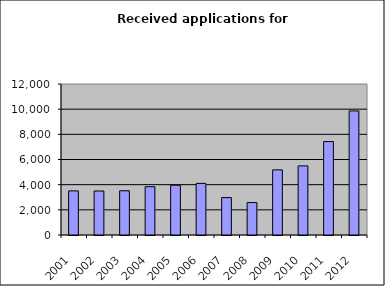
| Category | Series 0 |
|---|---|
| 2001.0 | 3505 |
| 2002.0 | 3497 |
| 2003.0 | 3516 |
| 2004.0 | 3838 |
| 2005.0 | 3956 |
| 2006.0 | 4101 |
| 2007.0 | 2972 |
| 2008.0 | 2577 |
| 2009.0 | 5177 |
| 2010.0 | 5491 |
| 2011.0 | 7426 |
| 2012.0 | 9860 |